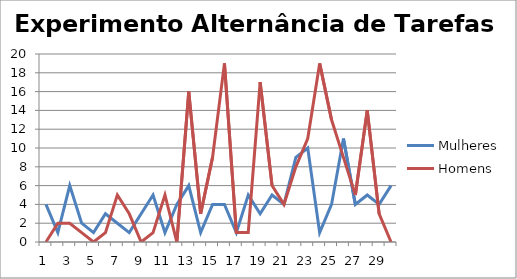
| Category | Mulheres | Homens |
|---|---|---|
| 0 | 4 | 0 |
| 1 | 1 | 2 |
| 2 | 6 | 2 |
| 3 | 2 | 1 |
| 4 | 1 | 0 |
| 5 | 3 | 1 |
| 6 | 2 | 5 |
| 7 | 1 | 3 |
| 8 | 3 | 0 |
| 9 | 5 | 1 |
| 10 | 1 | 5 |
| 11 | 4 | 0 |
| 12 | 6 | 16 |
| 13 | 1 | 3 |
| 14 | 4 | 9 |
| 15 | 4 | 19 |
| 16 | 1 | 1 |
| 17 | 5 | 1 |
| 18 | 3 | 17 |
| 19 | 5 | 6 |
| 20 | 4 | 4 |
| 21 | 9 | 8 |
| 22 | 10 | 11 |
| 23 | 1 | 19 |
| 24 | 4 | 13 |
| 25 | 11 | 9 |
| 26 | 4 | 5 |
| 27 | 5 | 14 |
| 28 | 4 | 3 |
| 29 | 6 | 0 |